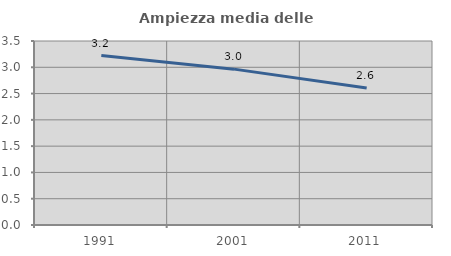
| Category | Ampiezza media delle famiglie |
|---|---|
| 1991.0 | 3.224 |
| 2001.0 | 2.965 |
| 2011.0 | 2.605 |